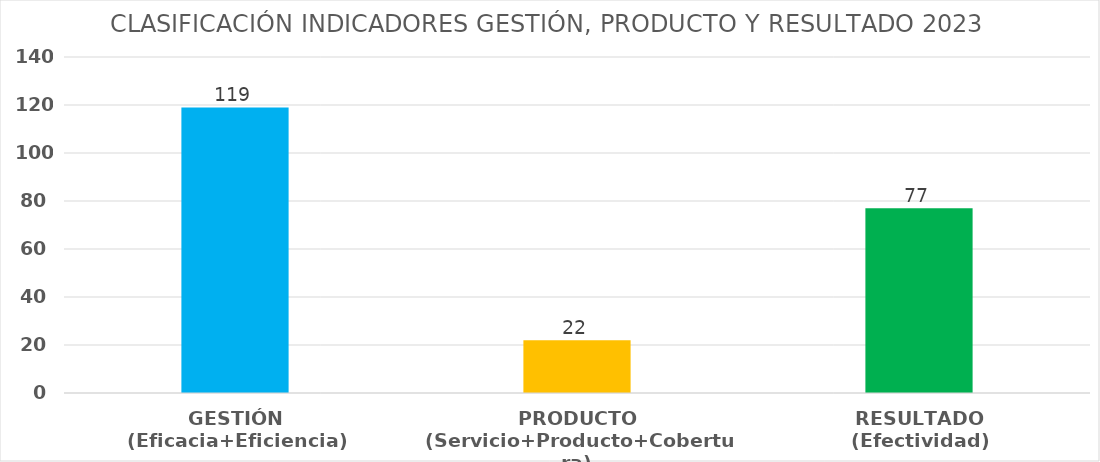
| Category | Series 0 |
|---|---|
| GESTIÓN
(Eficacia+Eficiencia) | 119 |
| PRODUCTO
(Servicio+Producto+Cobertura) | 22 |
| RESULTADO
(Efectividad) | 77 |